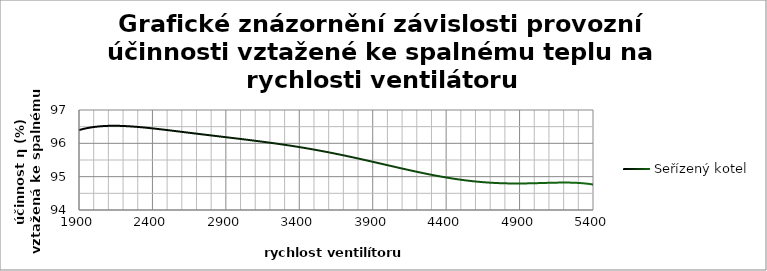
| Category | seřízený |
|---|---|
| 5400.0 | 95.8 |
| 1900.0 | 97.8 |
| 5400.0 | 95.9 |
| 1900.0 | 96.7 |
| 5400.0 | 95.1 |
| 1900.0 | 96.1 |
| 5400.0 | 94.8 |
| 5400.0 | 94.2 |
| 5400.0 | 94.3 |
| 5400.0 | 94 |
| 1900.0 | 95.6 |
| 1900.0 | 96.1 |
| 1900.0 | 96.5 |
| 1900.0 | 96.7 |
| 2400.0 | 96.9 |
| 2900.0 | 96.7 |
| 3400.0 | 96.3 |
| 3900.0 | 95.9 |
| 4400.0 | 95.4 |
| 4900.0 | 94.7 |
| 5400.0 | 94.4 |
| 4600.0 | 94.6 |
| 4100.0 | 94.8 |
| 3700.0 | 95.2 |
| 3200.0 | 95.6 |
| 2600.0 | 95.9 |
| 2100.0 | 96.3 |
| 1900.0 | 95.5 |
| 2400.0 | 96.4 |
| 2900.0 | 96.5 |
| 3400.0 | 96.3 |
| 3900.0 | 95.8 |
| 4400.0 | 95.5 |
| 4900.0 | 94.9 |
| 5400.0 | 94.4 |
| 4600.0 | 94.6 |
| 4100.0 | 94.9 |
| 3700.0 | 95.2 |
| 3200.0 | 95.6 |
| 2600.0 | 96.1 |
| 2100.0 | 96.5 |
| 1900.0 | 96.7 |